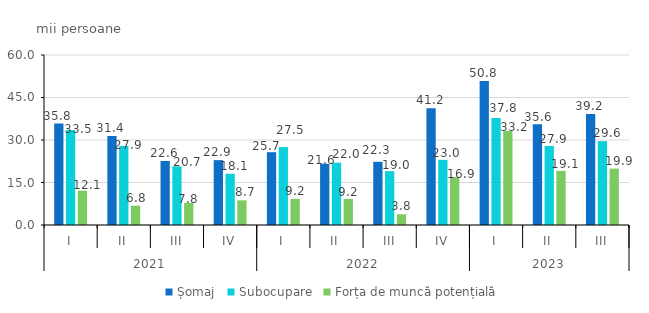
| Category | Șomaj | Subocupare | Forța de muncă potențială |
|---|---|---|---|
| 0 | 35.8 | 33.5 | 12.1 |
| 1 | 31.4 | 27.9 | 6.8 |
| 2 | 22.6 | 20.7 | 7.8 |
| 3 | 22.9 | 18.1 | 8.7 |
| 4 | 25.7 | 27.5 | 9.2 |
| 5 | 21.6 | 22 | 9.2 |
| 6 | 22.3 | 19 | 3.8 |
| 7 | 41.2 | 23 | 16.9 |
| 8 | 50.8 | 37.8 | 33.2 |
| 9 | 35.6 | 27.9 | 19.1 |
| 10 | 39.2 | 29.6 | 19.9 |